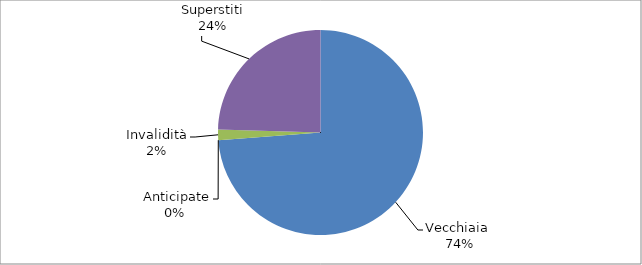
| Category | Series 0 |
|---|---|
| Vecchiaia  | 15011 |
|  Anticipate | 0 |
| Invalidità | 341 |
| Superstiti | 4987 |